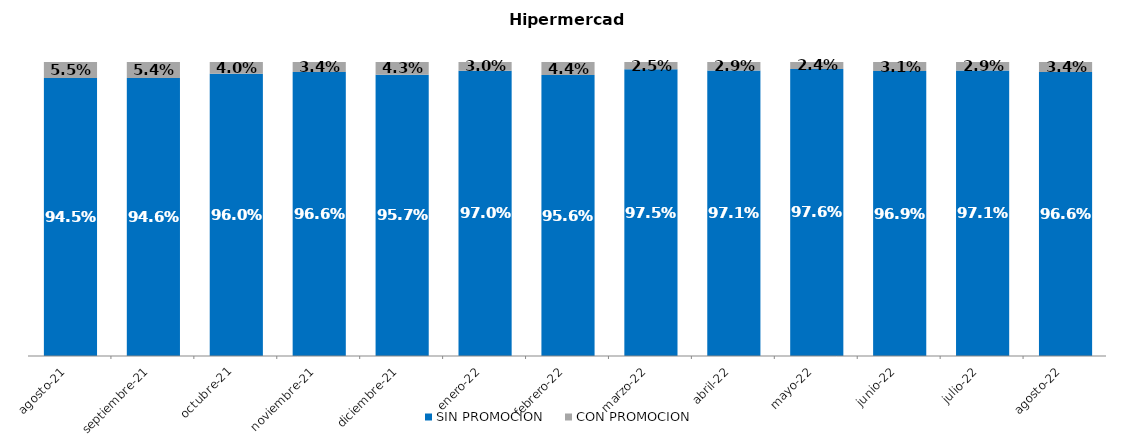
| Category | SIN PROMOCION   | CON PROMOCION   |
|---|---|---|
| 2021-08-01 | 0.945 | 0.055 |
| 2021-09-01 | 0.946 | 0.054 |
| 2021-10-01 | 0.96 | 0.04 |
| 2021-11-01 | 0.966 | 0.034 |
| 2021-12-01 | 0.957 | 0.043 |
| 2022-01-01 | 0.97 | 0.03 |
| 2022-02-01 | 0.956 | 0.044 |
| 2022-03-01 | 0.975 | 0.025 |
| 2022-04-01 | 0.971 | 0.029 |
| 2022-05-01 | 0.976 | 0.024 |
| 2022-06-01 | 0.969 | 0.031 |
| 2022-07-01 | 0.971 | 0.029 |
| 2022-08-01 | 0.966 | 0.034 |